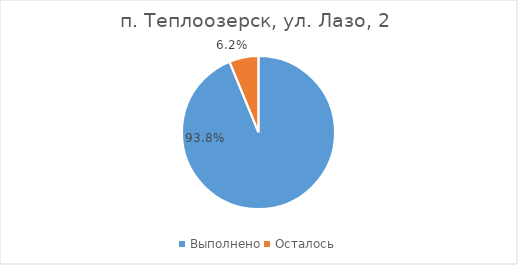
| Category | п. Теплоозерск, ул. Лазо, 2 |
|---|---|
| Выполнено | 0.938 |
| Осталось | 0.062 |